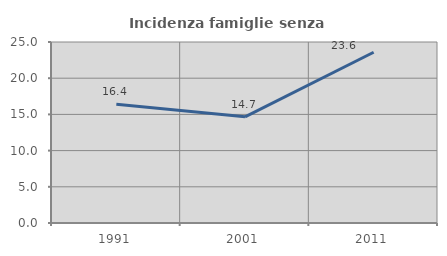
| Category | Incidenza famiglie senza nuclei |
|---|---|
| 1991.0 | 16.398 |
| 2001.0 | 14.661 |
| 2011.0 | 23.587 |